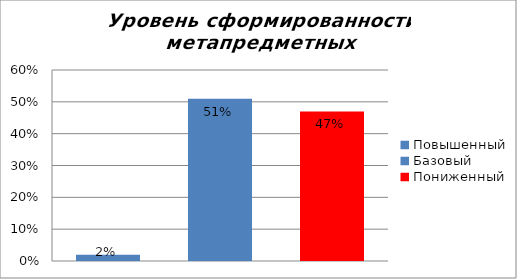
| Category | Уровень сформированности метапредметных результатов |
|---|---|
| Повышенный | 0.02 |
| Базовый | 0.51 |
| Пониженный | 0.47 |